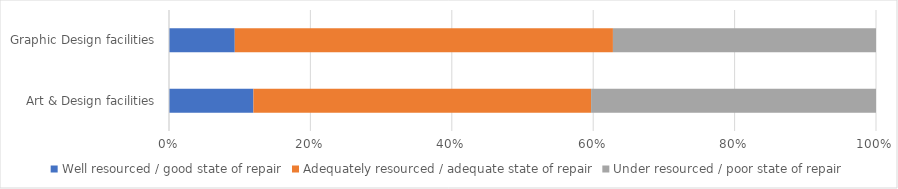
| Category | Well resourced / good state of repair | Adequately resourced / adequate state of repair | Under resourced / poor state of repair |
|---|---|---|---|
| Art & Design facilities | 0.119 | 0.478 | 0.403 |
| Graphic Design facilities | 0.093 | 0.535 | 0.372 |